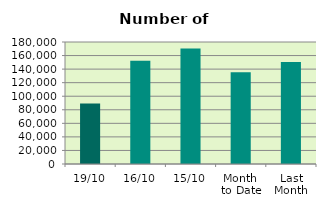
| Category | Series 0 |
|---|---|
| 19/10 | 89350 |
| 16/10 | 152232 |
| 15/10 | 170576 |
| Month 
to Date | 135526.154 |
| Last
Month | 150562.364 |